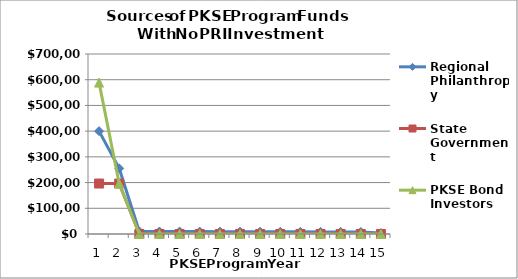
| Category | Regional Philanthropy | State Government | PKSE Bond Investors |
|---|---|---|---|
| 0 | 400000 | 196250 | 588750 |
| 1 | 255000 | 196250 | 196250 |
| 2 | 9900 | 0 | 0 |
| 3 | 9702 | 0 | 0 |
| 4 | 9507.96 | 0 | 0 |
| 5 | 9317.801 | 0 | 0 |
| 6 | 9131.445 | 0 | 0 |
| 7 | 8948.816 | 0 | 0 |
| 8 | 8769.84 | 0 | 0 |
| 9 | 8594.443 | 0 | 0 |
| 10 | 8422.554 | 0 | 0 |
| 11 | 8254.103 | 0 | 0 |
| 12 | 8089.021 | 0 | 0 |
| 13 | 7927.24 | 0 | 0 |
| 14 | 3923.584 | 0 | 0 |